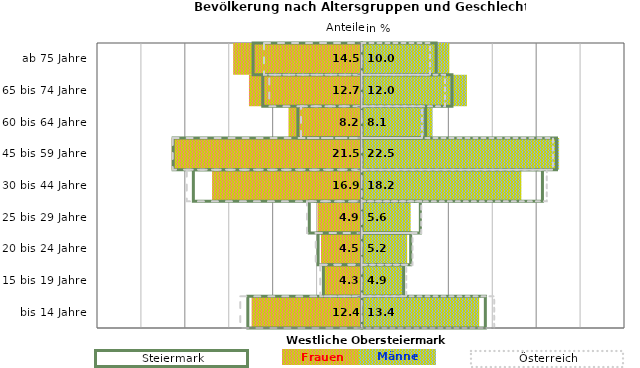
| Category | Frauen | Männer | Frauen Spalte2 | Männer Spalte2 | Frauen Spalte3 | Männer Spalte3 |
|---|---|---|---|---|---|---|
| bis 14 Jahre | -12.4 | 13.4 | 14.1 | -13 | -13.8 | 15.1 |
| 15 bis 19 Jahre | -4.3 | 4.9 | 4.8 | -4.4 | -4.7 | 5.1 |
| 20 bis 24 Jahre | -4.5 | 5.2 | 5.6 | -5 | -5.2 | 5.8 |
| 25 bis 29 Jahre | -4.9 | 5.6 | 6.7 | -6 | -6.2 | 6.8 |
| 30 bis 44 Jahre | -16.9 | 18.2 | 20.6 | -19.2 | -19.9 | 21.1 |
| 45 bis 59 Jahre | -21.5 | 22.5 | 22.2 | -21.5 | -21.5 | 21.8 |
| 60 bis 64 Jahre | -8.2 | 8.1 | 7.3 | -7.3 | -6.9 | 6.9 |
| 65 bis 74 Jahre | -12.7 | 12 | 10.3 | -11.3 | -10.5 | 9.5 |
| ab 75 Jahre | -14.5 | 10 | 8.5 | -12.4 | -11.1 | 7.8 |